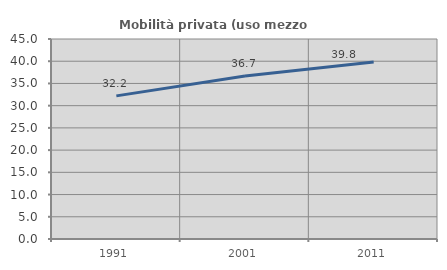
| Category | Mobilità privata (uso mezzo privato) |
|---|---|
| 1991.0 | 32.203 |
| 2001.0 | 36.697 |
| 2011.0 | 39.831 |